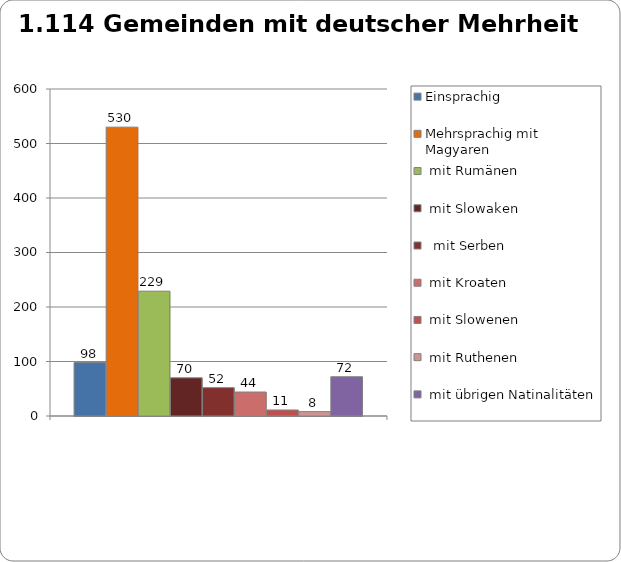
| Category | Einsprachig | Mehrsprachig mit Magyaren | Mehrsprachig mit Rumänen | Mehrsprachig mit Slowaken | Mehrsprachig  mit Serben  | Mehrsprachig mit Kroaten | Mehrsprachig mit Slowenen | Mehrsprachig mit Ruthenen | Mehrsprachig mit übrigen Natinalitäten |
|---|---|---|---|---|---|---|---|---|---|
| 0 | 98 | 530 | 229 | 70 | 52 | 44 | 11 | 8 | 72 |